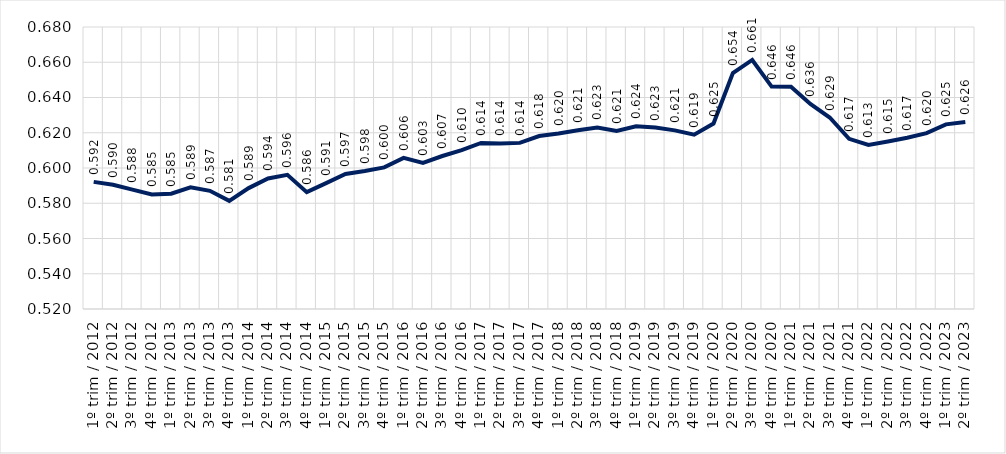
| Category | Conjunto RMs |
|---|---|
| 1º trim / 2012 | 0.592 |
| 2º trim / 2012 | 0.59 |
| 3º trim / 2012 | 0.588 |
| 4º trim / 2012 | 0.585 |
| 1º trim / 2013 | 0.585 |
| 2º trim / 2013 | 0.589 |
| 3º trim / 2013 | 0.587 |
| 4º trim / 2013 | 0.581 |
| 1º trim / 2014 | 0.589 |
| 2º trim / 2014 | 0.594 |
| 3º trim / 2014 | 0.596 |
| 4º trim / 2014 | 0.586 |
| 1º trim / 2015 | 0.591 |
| 2º trim / 2015 | 0.597 |
| 3º trim / 2015 | 0.598 |
| 4º trim / 2015 | 0.6 |
| 1º trim / 2016 | 0.606 |
| 2º trim / 2016 | 0.603 |
| 3º trim / 2016 | 0.607 |
| 4º trim / 2016 | 0.61 |
| 1º trim / 2017 | 0.614 |
| 2º trim / 2017 | 0.614 |
| 3º trim / 2017 | 0.614 |
| 4º trim / 2017 | 0.618 |
| 1º trim / 2018 | 0.62 |
| 2º trim / 2018 | 0.621 |
| 3º trim / 2018 | 0.623 |
| 4º trim / 2018 | 0.621 |
| 1º trim / 2019 | 0.624 |
| 2º trim / 2019 | 0.623 |
| 3º trim / 2019 | 0.621 |
| 4º trim / 2019 | 0.619 |
| 1º trim / 2020 | 0.625 |
| 2º trim / 2020 | 0.654 |
| 3º trim / 2020 | 0.661 |
| 4º trim / 2020 | 0.646 |
| 1º trim / 2021 | 0.646 |
| 2º trim / 2021 | 0.636 |
| 3º trim / 2021 | 0.629 |
| 4º trim / 2021 | 0.617 |
| 1º trim / 2022 | 0.613 |
| 2º trim / 2022 | 0.615 |
| 3º trim / 2022 | 0.617 |
| 4º trim / 2022 | 0.62 |
| 1º trim / 2023 | 0.625 |
| 2º trim / 2023 | 0.626 |